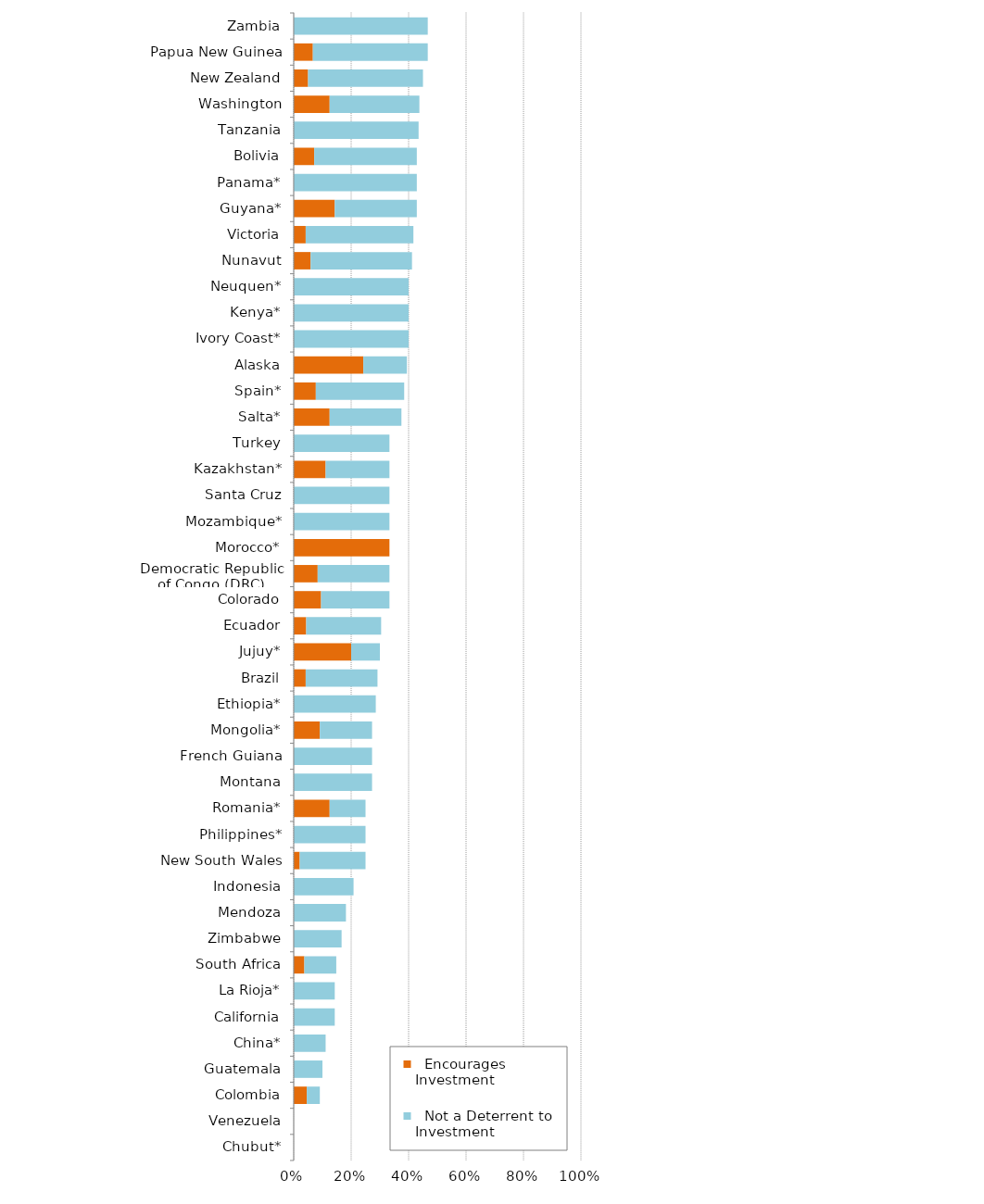
| Category |   Encourages Investment |   Not a Deterrent to Investment |
|---|---|---|
| Chubut* | 0 | 0 |
| Venezuela | 0 | 0 |
| Colombia | 0.045 | 0.045 |
| Guatemala | 0 | 0.1 |
| China* | 0 | 0.111 |
| California | 0 | 0.143 |
| La Rioja* | 0 | 0.143 |
| South Africa | 0.037 | 0.111 |
| Zimbabwe | 0 | 0.167 |
| Mendoza | 0 | 0.182 |
| Indonesia | 0 | 0.208 |
| New South Wales | 0.021 | 0.229 |
| Philippines* | 0 | 0.25 |
| Romania* | 0.125 | 0.125 |
| Montana | 0 | 0.273 |
| French Guiana | 0 | 0.273 |
| Mongolia* | 0.091 | 0.182 |
| Ethiopia* | 0 | 0.286 |
| Brazil | 0.042 | 0.25 |
| Jujuy* | 0.2 | 0.1 |
| Ecuador | 0.043 | 0.261 |
| Colorado | 0.095 | 0.238 |
| Democratic Republic of Congo (DRC) | 0.083 | 0.25 |
| Morocco* | 0.333 | 0 |
| Mozambique* | 0 | 0.333 |
| Santa Cruz | 0 | 0.333 |
| Kazakhstan* | 0.111 | 0.222 |
| Turkey | 0 | 0.333 |
| Salta* | 0.125 | 0.25 |
| Spain* | 0.077 | 0.308 |
| Alaska | 0.242 | 0.152 |
| Ivory Coast* | 0 | 0.4 |
| Kenya* | 0 | 0.4 |
| Neuquen* | 0 | 0.4 |
| Nunavut | 0.059 | 0.353 |
| Victoria | 0.042 | 0.375 |
| Guyana* | 0.143 | 0.286 |
| Panama* | 0 | 0.429 |
| Bolivia | 0.071 | 0.357 |
| Tanzania | 0 | 0.435 |
| Washington | 0.125 | 0.312 |
| New Zealand | 0.05 | 0.4 |
| Papua New Guinea | 0.067 | 0.4 |
| Zambia | 0 | 0.467 |